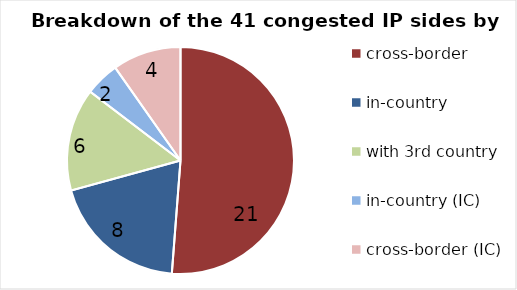
| Category | number |
|---|---|
| cross-border | 21 |
| in-country | 8 |
| with 3rd country | 6 |
| in-country (IC) | 2 |
| cross-border (IC) | 4 |